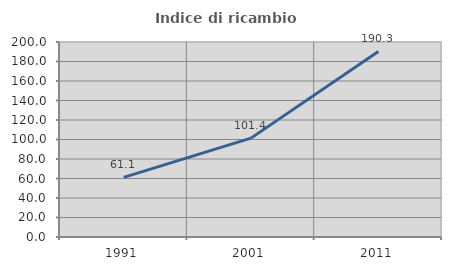
| Category | Indice di ricambio occupazionale  |
|---|---|
| 1991.0 | 61.143 |
| 2001.0 | 101.418 |
| 2011.0 | 190.278 |